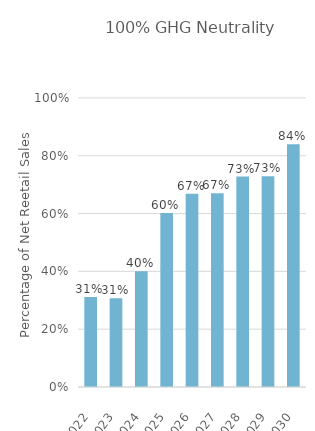
| Category | Series 0 |
|---|---|
| 2022.0 | 0.312 |
| 2023.0 | 0.307 |
| 2024.0 | 0.4 |
| 2025.0 | 0.602 |
| 2026.0 | 0.669 |
| 2027.0 | 0.671 |
| 2028.0 | 0.728 |
| 2029.0 | 0.729 |
| 2030.0 | 0.84 |